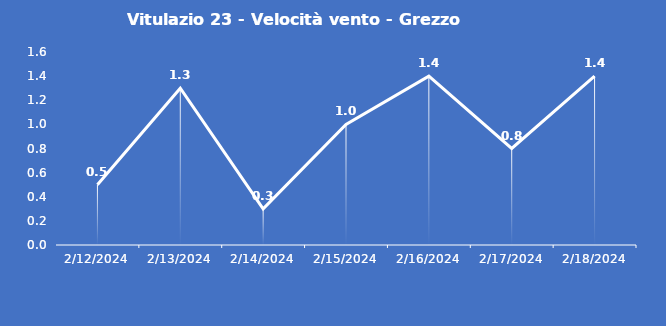
| Category | Vitulazio 23 - Velocità vento - Grezzo (m/s) |
|---|---|
| 2/12/24 | 0.5 |
| 2/13/24 | 1.3 |
| 2/14/24 | 0.3 |
| 2/15/24 | 1 |
| 2/16/24 | 1.4 |
| 2/17/24 | 0.8 |
| 2/18/24 | 1.4 |